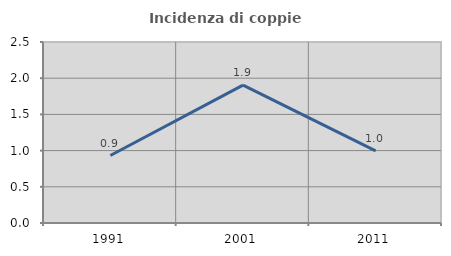
| Category | Incidenza di coppie miste |
|---|---|
| 1991.0 | 0.932 |
| 2001.0 | 1.905 |
| 2011.0 | 0.997 |